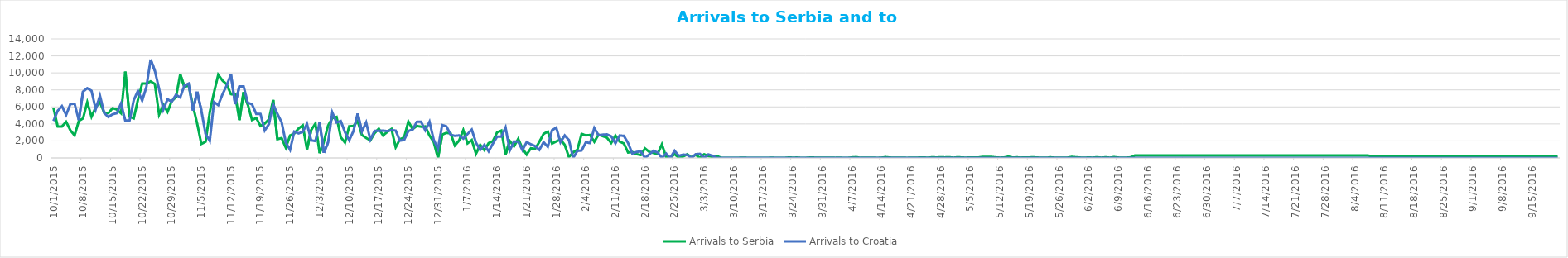
| Category | Arrivals to Serbia | Arrivals to Croatia |
|---|---|---|
| 10/1/15 | 5900 | 4344 |
| 10/2/15 | 3700 | 5546 |
| 10/3/15 | 3700 | 6086 |
| 10/4/15 | 4250 | 5065 |
| 10/5/15 | 3250 | 6338 |
| 10/6/15 | 2650 | 6370 |
| 10/7/15 | 4350 | 4446 |
| 10/8/15 | 4650 | 7798 |
| 10/9/15 | 6550 | 8201 |
| 10/10/15 | 4850 | 7896 |
| 10/11/15 | 5950 | 5732 |
| 10/12/15 | 6556 | 7317 |
| 10/13/15 | 5330 | 5286 |
| 10/14/15 | 5280 | 4814 |
| 10/15/15 | 5850 | 5138 |
| 10/16/15 | 5700 | 5260 |
| 10/17/15 | 5250 | 6415 |
| 10/18/15 | 10150 | 4390 |
| 10/19/15 | 4850 | 4388 |
| 10/20/15 | 4650 | 6793 |
| 10/21/15 | 6850 | 7900 |
| 10/22/15 | 8750 | 6748 |
| 10/23/15 | 8750 | 8348 |
| 10/24/15 | 9000 | 11570 |
| 10/25/15 | 8700 | 10249 |
| 10/26/15 | 5100 | 8128 |
| 10/27/15 | 6257 | 5683 |
| 10/28/15 | 5415 | 6900 |
| 10/29/15 | 6700 | 6615 |
| 10/30/15 | 7138 | 7429 |
| 10/31/15 | 9834 | 7110 |
| 11/1/15 | 8354 | 8534 |
| 11/2/15 | 8521 | 8746 |
| 11/3/15 | 6129 | 5573 |
| 11/4/15 | 4073 | 7792 |
| 11/5/15 | 1652 | 5587 |
| 11/6/15 | 1906 | 2809 |
| 11/7/15 | 5397 | 2000 |
| 11/8/15 | 7695 | 6579 |
| 11/9/15 | 9785 | 6214 |
| 11/10/15 | 9107 | 7474 |
| 11/11/15 | 8648 | 8524 |
| 11/12/15 | 7500 | 9823 |
| 11/13/15 | 7464 | 6314 |
| 11/14/15 | 4453 | 8405 |
| 11/15/15 | 7734 | 8415 |
| 11/16/15 | 6267 | 6490 |
| 11/17/15 | 4460 | 6304 |
| 11/18/15 | 4694 | 5180 |
| 11/19/15 | 3765 | 5167 |
| 11/20/15 | 4042 | 3230 |
| 11/21/15 | 4527 | 3977 |
| 11/22/15 | 6826 | 6305 |
| 11/23/15 | 2201 | 5184 |
| 11/24/15 | 2335 | 4203 |
| 11/25/15 | 1194 | 1808 |
| 11/26/15 | 2636 | 952 |
| 11/27/15 | 2878 | 3095 |
| 11/28/15 | 3454 | 2886 |
| 11/29/15 | 3825 | 3060 |
| 11/30/15 | 1009 | 4009 |
| 12/1/15 | 3284 | 2066 |
| 12/2/15 | 4040 | 1982 |
| 12/3/15 | 553 | 4174 |
| 12/4/15 | 1927 | 611 |
| 12/5/15 | 3799 | 1835 |
| 12/6/15 | 4686 | 5339 |
| 12/7/15 | 4823 | 4162 |
| 12/8/15 | 2437 | 4335 |
| 12/9/15 | 1807 | 3027 |
| 12/10/15 | 3723 | 2076 |
| 12/11/15 | 3747 | 3149 |
| 12/12/15 | 4339 | 5225 |
| 12/13/15 | 2698 | 3112 |
| 12/14/15 | 2353 | 4174 |
| 12/15/15 | 2067 | 2160 |
| 12/16/15 | 2916 | 3177 |
| 12/17/15 | 3438 | 3192 |
| 12/18/15 | 2649 | 3200 |
| 12/19/15 | 3052 | 3156 |
| 12/20/15 | 3405 | 3276 |
| 12/21/15 | 1253 | 3210 |
| 12/22/15 | 2186 | 2027 |
| 12/23/15 | 2415 | 2116 |
| 12/24/15 | 4279 | 3166 |
| 12/25/15 | 3390 | 3339 |
| 12/26/15 | 3757 | 4241 |
| 12/27/15 | 3674 | 4251 |
| 12/28/15 | 3708 | 3249 |
| 12/29/15 | 2629 | 4253 |
| 12/30/15 | 1879 | 2132 |
| 12/31/15 | 0 | 1058 |
| 1/1/16 | 2745 | 3869 |
| 1/2/16 | 2947 | 3710 |
| 1/3/16 | 2889 | 2732 |
| 1/4/16 | 1462 | 2591 |
| 1/5/16 | 2041 | 2650 |
| 1/6/16 | 3273 | 2273 |
| 1/7/16 | 1715 | 2814 |
| 1/8/16 | 2100 | 3332 |
| 1/9/16 | 489 | 1799 |
| 1/10/16 | 1538 | 942 |
| 1/11/16 | 905 | 1549 |
| 1/12/16 | 1743 | 769 |
| 1/13/16 | 1973 | 1679 |
| 1/14/16 | 3006 | 2502 |
| 1/15/16 | 3213 | 2493 |
| 1/16/16 | 415 | 3579 |
| 1/17/16 | 1995 | 878 |
| 1/18/16 | 1362 | 1930 |
| 1/19/16 | 2244 | 1917 |
| 1/20/16 | 1113 | 914 |
| 1/21/16 | 397 | 1865 |
| 1/22/16 | 1134 | 1599 |
| 1/23/16 | 1064 | 1394 |
| 1/24/16 | 1895 | 946 |
| 1/25/16 | 2827 | 1847 |
| 1/26/16 | 3091 | 1309 |
| 1/27/16 | 1695 | 3256 |
| 1/28/16 | 1940 | 3565 |
| 1/29/16 | 2167 | 1843 |
| 1/30/16 | 1540 | 2641 |
| 1/31/16 | 103 | 2098 |
| 2/1/16 | 660 | 0 |
| 2/2/16 | 966 | 822 |
| 2/3/16 | 2825 | 881 |
| 2/4/16 | 2653 | 1836 |
| 2/5/16 | 2694 | 1750 |
| 2/6/16 | 1901 | 3510 |
| 2/7/16 | 2739 | 2658 |
| 2/8/16 | 2563 | 2736 |
| 2/9/16 | 2379 | 2764 |
| 2/10/16 | 1758 | 2544 |
| 2/11/16 | 2636 | 1716 |
| 2/12/16 | 1923 | 2635 |
| 2/13/16 | 1699 | 2595 |
| 2/14/16 | 641 | 1749 |
| 2/15/16 | 691 | 512 |
| 2/16/16 | 443 | 701 |
| 2/17/16 | 345 | 769 |
| 2/18/16 | 1117 | 0 |
| 2/19/16 | 713 | 408 |
| 2/20/16 | 580 | 834 |
| 2/21/16 | 476 | 630 |
| 2/22/16 | 1595 | 0 |
| 2/23/16 | 106 | 507 |
| 2/24/16 | 1 | 0 |
| 2/25/16 | 475 | 841 |
| 2/26/16 | 0 | 250 |
| 2/27/16 | 158 | 385 |
| 2/28/16 | 431 | 358 |
| 2/29/16 | 69 | 0 |
| 3/1/16 | 372 | 436 |
| 3/2/16 | 16 | 476 |
| 3/3/16 | 428 | 0 |
| 3/4/16 | 218 | 410 |
| 3/5/16 | 115 | 253 |
| 3/6/16 | 236 | 0 |
| 3/7/16 | 14 | 0 |
| 3/8/16 | 0 | 0 |
| 3/9/16 | 3 | 0 |
| 3/10/16 | 0 | 0 |
| 3/11/16 | 0 | 0 |
| 3/12/16 | 35 | 0 |
| 3/13/16 | 12 | 0 |
| 3/14/16 | 0 | 0 |
| 3/15/16 | 0 | 0 |
| 3/16/16 | 0 | 0 |
| 3/17/16 | 0 | 0 |
| 3/18/16 | 0 | 0 |
| 3/19/16 | 30 | 0 |
| 3/20/16 | 0 | 0 |
| 3/21/16 | 0 | 0 |
| 3/22/16 | 0 | 0 |
| 3/23/16 | 49 | 0 |
| 3/24/16 | 31 | 0 |
| 3/25/16 | 40 | 0 |
| 3/26/16 | 0 | 0 |
| 3/27/16 | 4 | 0 |
| 3/28/16 | 42 | 0 |
| 3/29/16 | 37 | 0 |
| 3/30/16 | 21 | 0 |
| 3/31/16 | 14 | 0 |
| 4/1/16 | 28 | 0 |
| 4/2/16 | 32 | 0 |
| 4/3/16 | 10 | 0 |
| 4/4/16 | 28 | 0 |
| 4/5/16 | 0 | 0 |
| 4/6/16 | 4 | 0 |
| 4/7/16 | 58 | 0 |
| 4/8/16 | 93 | 0 |
| 4/9/16 | 8 | 0 |
| 4/10/16 | 30 | 0 |
| 4/11/16 | 34 | 0 |
| 4/12/16 | 22 | 0 |
| 4/13/16 | 3 | 0 |
| 4/14/16 | 34 | 0 |
| 4/15/16 | 90 | 0 |
| 4/16/16 | 41 | 0 |
| 4/17/16 | 15 | 0 |
| 4/18/16 | 17 | 0 |
| 4/19/16 | 34 | 0 |
| 4/20/16 | 5 | 0 |
| 4/21/16 | 31 | 0 |
| 4/22/16 | 19 | 0 |
| 4/23/16 | 45 | 0 |
| 4/24/16 | 38 | 0 |
| 4/25/16 | 34 | 0 |
| 4/26/16 | 73 | 0 |
| 4/27/16 | 54 | 0 |
| 4/28/16 | 69 | 0 |
| 4/29/16 | 59 | 0 |
| 4/30/16 | 80 | 0 |
| 5/1/16 | 26 | 0 |
| 5/2/16 | 81 | 0 |
| 5/3/16 | 50 | 0 |
| 5/4/16 | 25 | 0 |
| 5/5/16 | 58 | 0 |
| 5/6/16 | 49 | 0 |
| 5/7/16 | 59 | 0 |
| 5/8/16 | 128 | 0 |
| 5/9/16 | 113 | 0 |
| 5/10/16 | 119 | 0 |
| 5/11/16 | 62 | 0 |
| 5/12/16 | 33 | 0 |
| 5/13/16 | 51 | 0 |
| 5/14/16 | 161 | 0 |
| 5/15/16 | 45 | 0 |
| 5/16/16 | 71 | 0 |
| 5/17/16 | 35 | 0 |
| 5/18/16 | 44 | 0 |
| 5/19/16 | 55 | 0 |
| 5/20/16 | 74 | 0 |
| 5/21/16 | 39 | 0 |
| 5/22/16 | 16 | 0 |
| 5/23/16 | 15 | 0 |
| 5/24/16 | 68 | 0 |
| 5/25/16 | 23 | 0 |
| 5/26/16 | 15 | 0 |
| 5/27/16 | 20 | 0 |
| 5/28/16 | 35 | 0 |
| 5/29/16 | 121 | 0 |
| 5/30/16 | 75 | 0 |
| 5/31/16 | 37 | 0 |
| 6/1/16 | 29 | 0 |
| 6/2/16 | 43 | 0 |
| 6/3/16 | 32 | 0 |
| 6/4/16 | 80 | 0 |
| 6/5/16 | 26 | 0 |
| 6/6/16 | 74 | 0 |
| 6/7/16 | 28 | 0 |
| 6/8/16 | 101 | 0 |
| 6/9/16 | 38 | 0 |
| 6/10/16 | 27 | 0 |
| 6/11/16 | 32 | 0 |
| 6/12/16 | 71 | 0 |
| 6/13/16 | 300 | 0 |
| 6/14/16 | 300 | 0 |
| 6/15/16 | 300 | 0 |
| 6/16/16 | 300 | 0 |
| 6/17/16 | 300 | 0 |
| 6/18/16 | 300 | 0 |
| 6/19/16 | 300 | 0 |
| 6/20/16 | 300 | 0 |
| 6/21/16 | 300 | 0 |
| 6/22/16 | 300 | 0 |
| 6/23/16 | 300 | 0 |
| 6/24/16 | 300 | 0 |
| 6/25/16 | 300 | 0 |
| 6/26/16 | 300 | 0 |
| 6/27/16 | 300 | 0 |
| 6/28/16 | 300 | 0 |
| 6/29/16 | 300 | 0 |
| 6/30/16 | 300 | 0 |
| 7/1/16 | 300 | 0 |
| 7/2/16 | 300 | 0 |
| 7/3/16 | 300 | 0 |
| 7/4/16 | 300 | 0 |
| 7/5/16 | 300 | 0 |
| 7/6/16 | 300 | 0 |
| 7/7/16 | 300 | 0 |
| 7/8/16 | 300 | 0 |
| 7/9/16 | 300 | 0 |
| 7/10/16 | 300 | 0 |
| 7/11/16 | 300 | 0 |
| 7/12/16 | 300 | 0 |
| 7/13/16 | 300 | 0 |
| 7/14/16 | 300 | 0 |
| 7/15/16 | 300 | 0 |
| 7/16/16 | 300 | 0 |
| 7/17/16 | 300 | 0 |
| 7/18/16 | 300 | 0 |
| 7/19/16 | 300 | 0 |
| 7/20/16 | 300 | 0 |
| 7/21/16 | 300 | 0 |
| 7/22/16 | 300 | 0 |
| 7/23/16 | 300 | 0 |
| 7/24/16 | 300 | 0 |
| 7/25/16 | 300 | 0 |
| 7/26/16 | 300 | 0 |
| 7/27/16 | 300 | 0 |
| 7/28/16 | 300 | 0 |
| 7/29/16 | 300 | 0 |
| 7/30/16 | 300 | 0 |
| 7/31/16 | 300 | 0 |
| 8/1/16 | 300 | 0 |
| 8/2/16 | 300 | 0 |
| 8/3/16 | 300 | 0 |
| 8/4/16 | 300 | 0 |
| 8/5/16 | 300 | 0 |
| 8/6/16 | 300 | 0 |
| 8/7/16 | 300 | 0 |
| 8/8/16 | 200 | 0 |
| 8/9/16 | 200 | 0 |
| 8/10/16 | 200 | 0 |
| 8/11/16 | 200 | 0 |
| 8/12/16 | 200 | 0 |
| 8/13/16 | 200 | 0 |
| 8/14/16 | 200 | 0 |
| 8/15/16 | 200 | 0 |
| 8/16/16 | 200 | 0 |
| 8/17/16 | 200 | 0 |
| 8/18/16 | 200 | 0 |
| 8/19/16 | 200 | 0 |
| 8/20/16 | 200 | 0 |
| 8/21/16 | 200 | 0 |
| 8/22/16 | 200 | 0 |
| 8/23/16 | 200 | 0 |
| 8/24/16 | 200 | 0 |
| 8/25/16 | 200 | 0 |
| 8/26/16 | 200 | 0 |
| 8/27/16 | 200 | 0 |
| 8/28/16 | 200 | 0 |
| 8/29/16 | 200 | 0 |
| 8/30/16 | 200 | 0 |
| 8/31/16 | 200 | 0 |
| 9/1/16 | 200 | 0 |
| 9/2/16 | 200 | 0 |
| 9/3/16 | 200 | 0 |
| 9/4/16 | 200 | 0 |
| 9/5/16 | 200 | 0 |
| 9/6/16 | 200 | 0 |
| 9/7/16 | 200 | 0 |
| 9/8/16 | 200 | 0 |
| 9/9/16 | 200 | 0 |
| 9/10/16 | 200 | 0 |
| 9/11/16 | 200 | 0 |
| 9/12/16 | 200 | 0 |
| 9/13/16 | 200 | 0 |
| 9/14/16 | 200 | 0 |
| 9/15/16 | 200 | 0 |
| 9/16/16 | 200 | 0 |
| 9/17/16 | 200 | 0 |
| 9/18/16 | 200 | 0 |
| 9/19/16 | 200 | 0 |
| 9/20/16 | 200 | 0 |
| 9/21/16 | 200 | 0 |